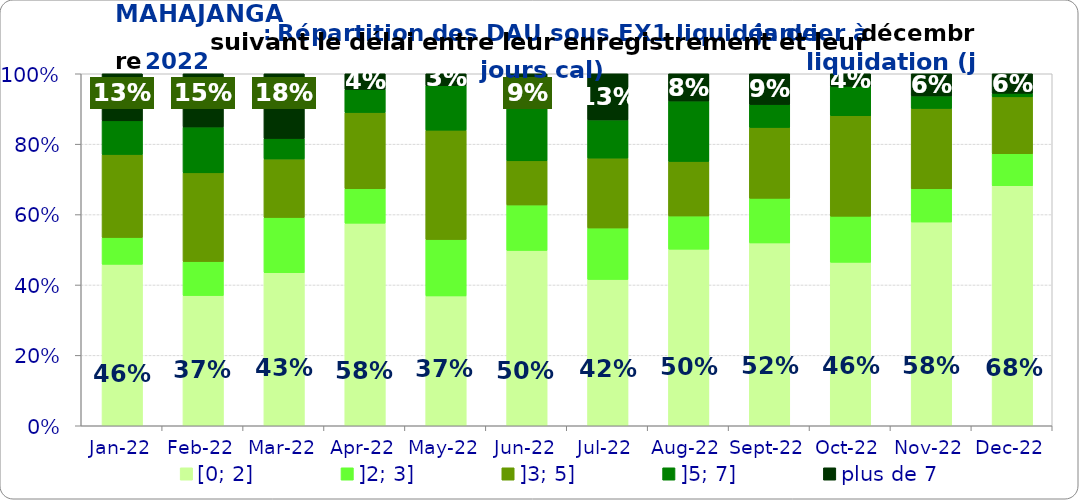
| Category | [0; 2] | ]2; 3] | ]3; 5] | ]5; 7] | plus de 7 |
|---|---|---|---|---|---|
| 2022-01-01 | 0.459 | 0.076 | 0.236 | 0.096 | 0.134 |
| 2022-02-01 | 0.37 | 0.097 | 0.252 | 0.13 | 0.151 |
| 2022-03-01 | 0.435 | 0.157 | 0.166 | 0.058 | 0.184 |
| 2022-04-01 | 0.576 | 0.098 | 0.216 | 0.065 | 0.045 |
| 2022-05-01 | 0.369 | 0.16 | 0.311 | 0.126 | 0.034 |
| 2022-06-01 | 0.498 | 0.129 | 0.125 | 0.161 | 0.086 |
| 2022-07-01 | 0.416 | 0.146 | 0.199 | 0.109 | 0.131 |
| 2022-08-01 | 0.502 | 0.094 | 0.155 | 0.172 | 0.077 |
| 2022-09-01 | 0.519 | 0.127 | 0.201 | 0.065 | 0.088 |
| 2022-10-01 | 0.464 | 0.131 | 0.286 | 0.083 | 0.036 |
| 2022-11-01 | 0.579 | 0.094 | 0.228 | 0.035 | 0.063 |
| 2022-12-01 | 0.682 | 0.091 | 0.162 | 0.01 | 0.056 |